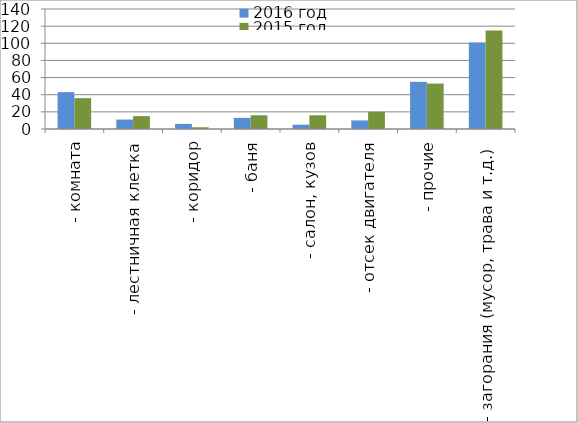
| Category | 2016 год | 2015 год |
|---|---|---|
|  - комната | 43 | 36 |
|  - лестничная клетка | 11 | 15 |
|  - коридор | 6 | 2 |
|  - баня | 13 | 16 |
|  - салон, кузов | 5 | 16 |
|  - отсек двигателя | 10 | 20 |
| - прочие | 55 | 53 |
| - загорания (мусор, трава и т.д.)  | 101 | 115 |